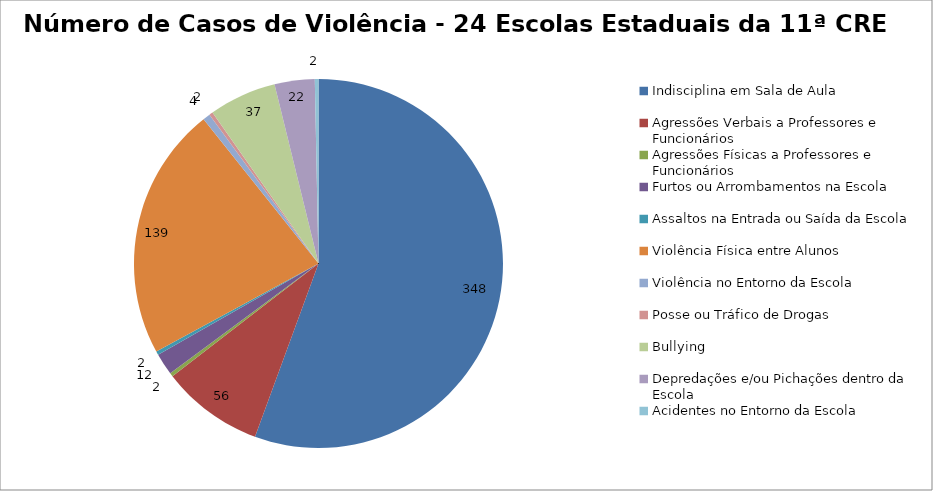
| Category | Número de Casos |
|---|---|
| Indisciplina em Sala de Aula | 348 |
| Agressões Verbais a Professores e Funcionários | 56 |
| Agressões Físicas a Professores e Funcionários | 2 |
| Furtos ou Arrombamentos na Escola | 12 |
| Assaltos na Entrada ou Saída da Escola | 2 |
| Violência Física entre Alunos | 139 |
| Violência no Entorno da Escola | 4 |
| Posse ou Tráfico de Drogas | 2 |
| Bullying | 37 |
| Depredações e/ou Pichações dentro da Escola | 22 |
| Acidentes no Entorno da Escola | 2 |